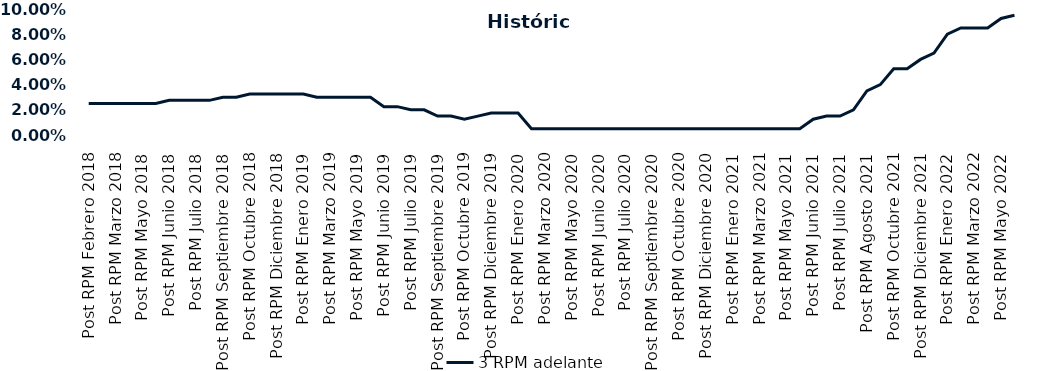
| Category | 3 RPM adelante |
|---|---|
| Post RPM Febrero 2018 | 0.025 |
| Pre RPM Marzo 2018 | 0.025 |
| Post RPM Marzo 2018 | 0.025 |
| Pre RPM Mayo 2018 | 0.025 |
| Post RPM Mayo 2018 | 0.025 |
| Pre RPM Junio 2018 | 0.025 |
| Post RPM Junio 2018 | 0.028 |
| Pre RPM Julio 2018 | 0.028 |
| Post RPM Julio 2018 | 0.028 |
| Pre RPM Septiembre 2018 | 0.028 |
| Post RPM Septiembre 2018 | 0.03 |
| Pre RPM Octubre 2018 | 0.03 |
| Post RPM Octubre 2018 | 0.032 |
| Pre RPM Diciembre 2018 | 0.032 |
| Post RPM Diciembre 2018 | 0.032 |
| Pre RPM Enero 2019 | 0.032 |
| Post RPM Enero 2019 | 0.032 |
| Pre RPM Marzo 2019 | 0.03 |
| Post RPM Marzo 2019 | 0.03 |
| Pre RPM Mayo 2019 | 0.03 |
| Post RPM Mayo 2019 | 0.03 |
| Pre RPM Junio 2019 | 0.03 |
| Post RPM Junio 2019 | 0.022 |
| Pre RPM Julio 2019 | 0.022 |
| Post RPM Julio 2019 | 0.02 |
| Pre RPM Septiembre 2019 | 0.02 |
| Post RPM Septiembre 2019 | 0.015 |
| Pre RPM Octubre 2019 | 0.015 |
| Post RPM Octubre 2019 | 0.012 |
| Pre RPM Diciembre 2019 | 0.015 |
| Post RPM Diciembre 2019 | 0.018 |
| Pre RPM Enero 2020 | 0.018 |
| Post RPM Enero 2020 | 0.018 |
| Pre RPM Marzo 2020 | 0.005 |
| Post RPM Marzo 2020 | 0.005 |
| Pre RPM Mayo 2020 | 0.005 |
| Post RPM Mayo 2020 | 0.005 |
| Pre RPM Junio 2020 | 0.005 |
| Post RPM Junio 2020 | 0.005 |
| Pre RPM Julio 2020 | 0.005 |
| Post RPM Julio 2020 | 0.005 |
| Pre RPM Septiembre 2020 | 0.005 |
| Post RPM Septiembre 2020 | 0.005 |
| Pre RPM Octubre 2020 | 0.005 |
| Post RPM Octubre 2020 | 0.005 |
| Pre RPM Diciembre 2020 | 0.005 |
| Post RPM Diciembre 2020 | 0.005 |
| Pre RPM Enero 2021 | 0.005 |
| Post RPM Enero 2021 | 0.005 |
| Pre RPM Marzo 2021 | 0.005 |
| Post RPM Marzo 2021 | 0.005 |
| Pre RPM Mayo 2021 | 0.005 |
| Post RPM Mayo 2021 | 0.005 |
| Pre RPM Junio 2021 | 0.005 |
| Post RPM Junio 2021 | 0.012 |
| Pre RPM Julio 2021 | 0.015 |
| Post RPM Julio 2021 | 0.015 |
| Pre RPM Agosto 2021 | 0.02 |
| Post RPM Agosto 2021 | 0.035 |
| Pre RPM Octubre 2021 | 0.04 |
| Post RPM Octubre 2021 | 0.052 |
| Pre RPM Diciembre 2021 | 0.052 |
| Post RPM Diciembre 2021 | 0.06 |
| Pre RPM Enero 2022 | 0.065 |
| Post RPM Enero 2022 | 0.08 |
| Pre RPM Marzo 2022 | 0.085 |
| Post RPM Marzo 2022 | 0.085 |
| Pre RPM Mayo 2022 | 0.085 |
| Post RPM Mayo 2022 | 0.092 |
| Pre RPM Junio 2022 | 0.095 |